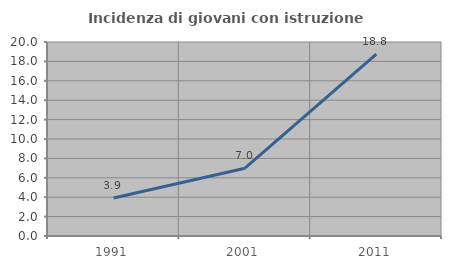
| Category | Incidenza di giovani con istruzione universitaria |
|---|---|
| 1991.0 | 3.922 |
| 2001.0 | 6.989 |
| 2011.0 | 18.75 |